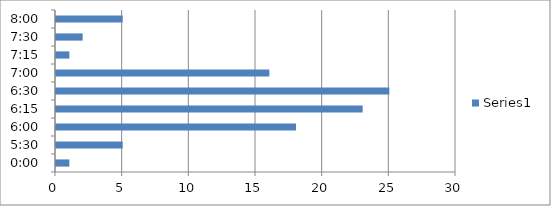
| Category | Series 0 |
|---|---|
| 0.0 | 1 |
| 0.22916666666666666 | 5 |
| 0.25 | 18 |
| 0.2604166666666667 | 23 |
| 0.2708333333333333 | 25 |
| 0.2916666666666667 | 16 |
| 0.3020833333333333 | 1 |
| 0.3125 | 2 |
| 0.3333333333333333 | 5 |